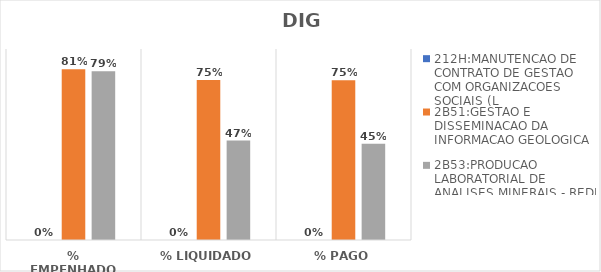
| Category | 212H:MANUTENCAO DE CONTRATO DE GESTAO COM ORGANIZACOES SOCIAIS (L | 2B51:GESTAO E DISSEMINACAO DA INFORMACAO GEOLOGICA | 2B53:PRODUCAO LABORATORIAL DE ANALISES MINERAIS - REDE LAMIN |
|---|---|---|---|
| % EMPENHADO | 0 | 0.805 | 0.795 |
| % LIQUIDADO | 0 | 0.754 | 0.469 |
| % PAGO | 0 | 0.753 | 0.454 |